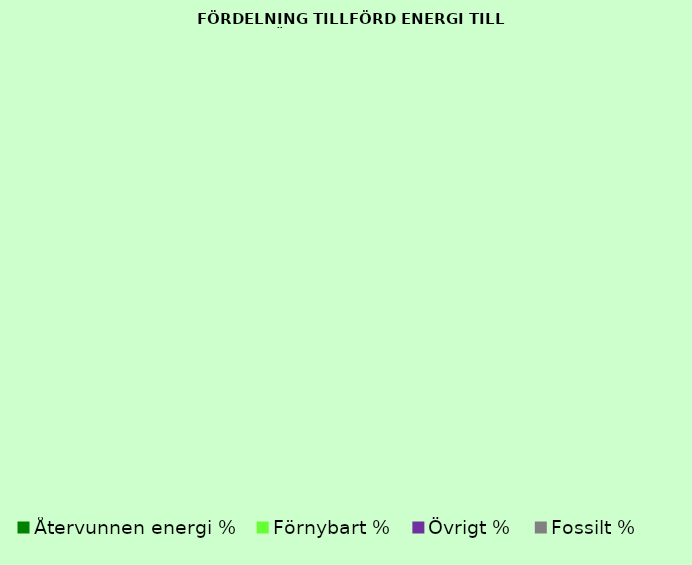
| Category | Series 0 |
|---|---|
| Återvunnen energi % | 0 |
| Förnybart % | 0 |
| Övrigt % | 0 |
| Fossilt % | 0 |